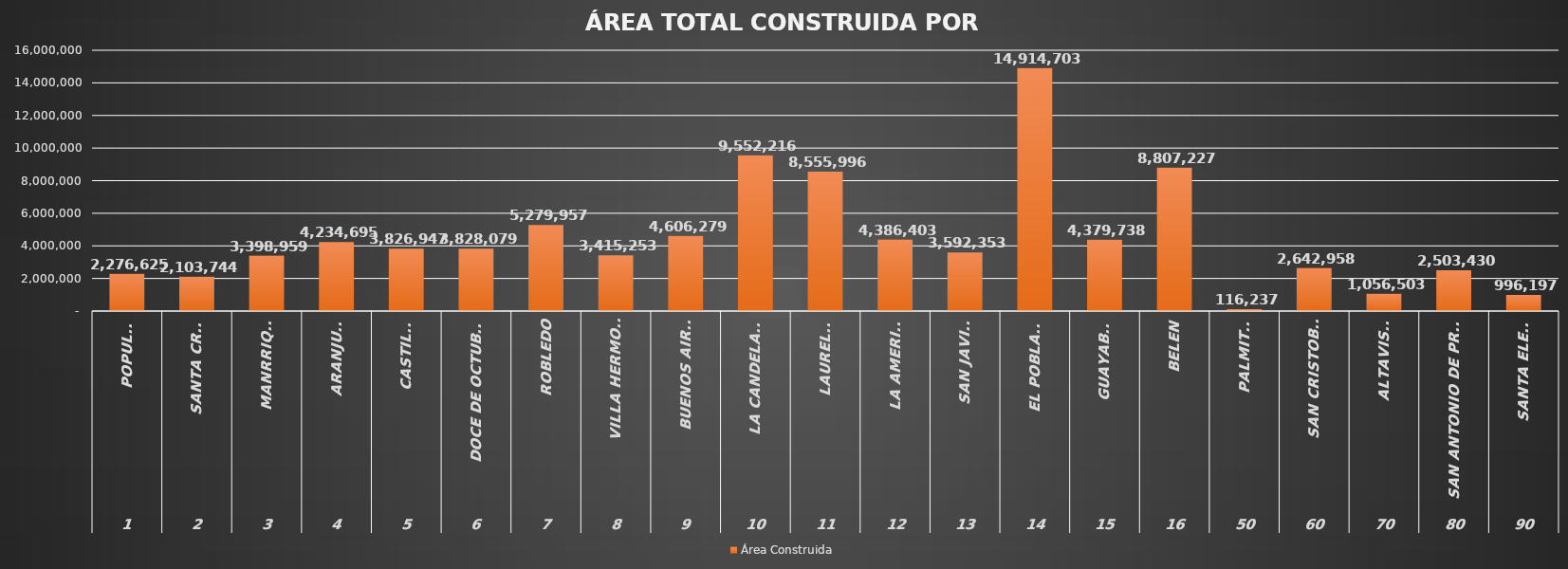
| Category | Área Construida |
|---|---|
| 0 | 2276625.26 |
| 1 | 2103743.83 |
| 2 | 3398959.2 |
| 3 | 4234695.49 |
| 4 | 3826947.4 |
| 5 | 3828079.3 |
| 6 | 5279957.35 |
| 7 | 3415253.09 |
| 8 | 4606279.44 |
| 9 | 9552216.36 |
| 10 | 8555996.29 |
| 11 | 4386403.22 |
| 12 | 3592352.58 |
| 13 | 14914702.62 |
| 14 | 4379737.91 |
| 15 | 8807227.17 |
| 16 | 116236.63 |
| 17 | 2642958.01 |
| 18 | 1056502.63 |
| 19 | 2503429.61 |
| 20 | 996197.15 |